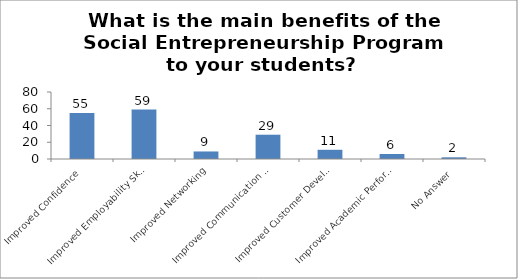
| Category | What is the main benefits of the Social Entrepreneurship program to your students? |
|---|---|
| Improved Confidence | 55 |
| Improved Employability Skills | 59 |
| Improved Networking | 9 |
| Improved Communication Skills | 29 |
| Improved Customer Development Skills | 11 |
| Improved Academic Performance | 6 |
| No Answer | 2 |